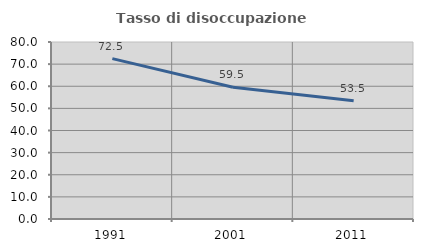
| Category | Tasso di disoccupazione giovanile  |
|---|---|
| 1991.0 | 72.5 |
| 2001.0 | 59.549 |
| 2011.0 | 53.468 |